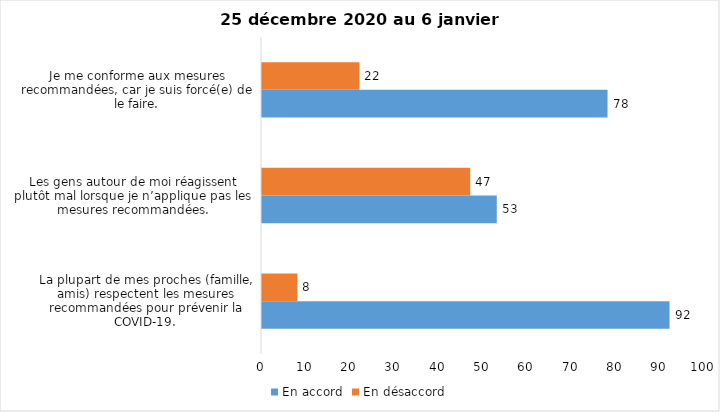
| Category | En accord | En désaccord |
|---|---|---|
| La plupart de mes proches (famille, amis) respectent les mesures recommandées pour prévenir la COVID-19. | 92 | 8 |
| Les gens autour de moi réagissent plutôt mal lorsque je n’applique pas les mesures recommandées. | 53 | 47 |
| Je me conforme aux mesures recommandées, car je suis forcé(e) de le faire. | 78 | 22 |